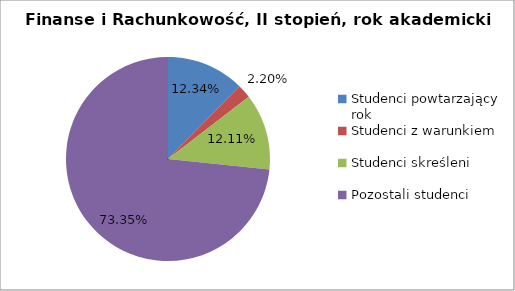
| Category | Series 0 |
|---|---|
| Studenci powtarzający rok | 56 |
| Studenci z warunkiem | 10 |
| Studenci skreśleni | 55 |
| Pozostali studenci | 333 |